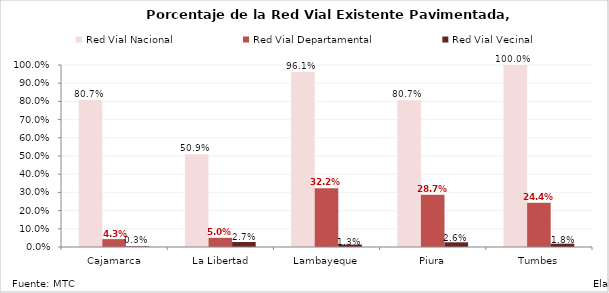
| Category | Red Vial Nacional | Red Vial Departamental | Red Vial Vecinal |
|---|---|---|---|
|  Cajamarca | 0.807 | 0.043 | 0.003 |
|  La Libertad | 0.509 | 0.05 | 0.027 |
|  Lambayeque | 0.961 | 0.322 | 0.013 |
|  Piura | 0.807 | 0.287 | 0.026 |
|  Tumbes | 1 | 0.244 | 0.018 |